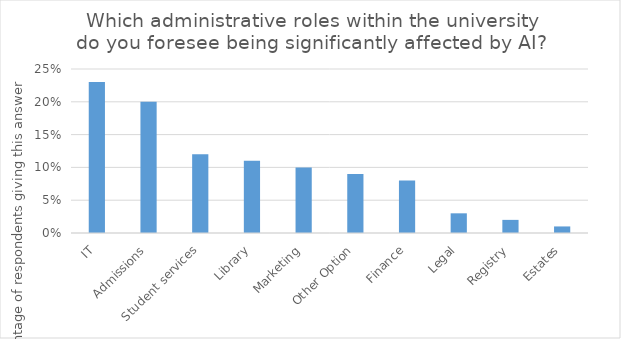
| Category | Series 0 |
|---|---|
|  IT | 0.23 |
|  Admissions | 0.2 |
|  Student services | 0.12 |
|  Library | 0.11 |
|  Marketing | 0.1 |
|  Other Option | 0.09 |
|  Finance | 0.08 |
|  Legal | 0.03 |
|  Registry | 0.02 |
|  Estates | 0.01 |